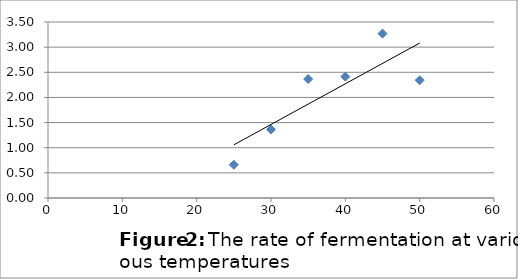
| Category | Series 0 |
|---|---|
| 25.0 | 0.661 |
| 30.0 | 1.364 |
| 35.0 | 2.365 |
| 40.0 | 2.413 |
| 45.0 | 3.27 |
| 50.0 | 2.341 |